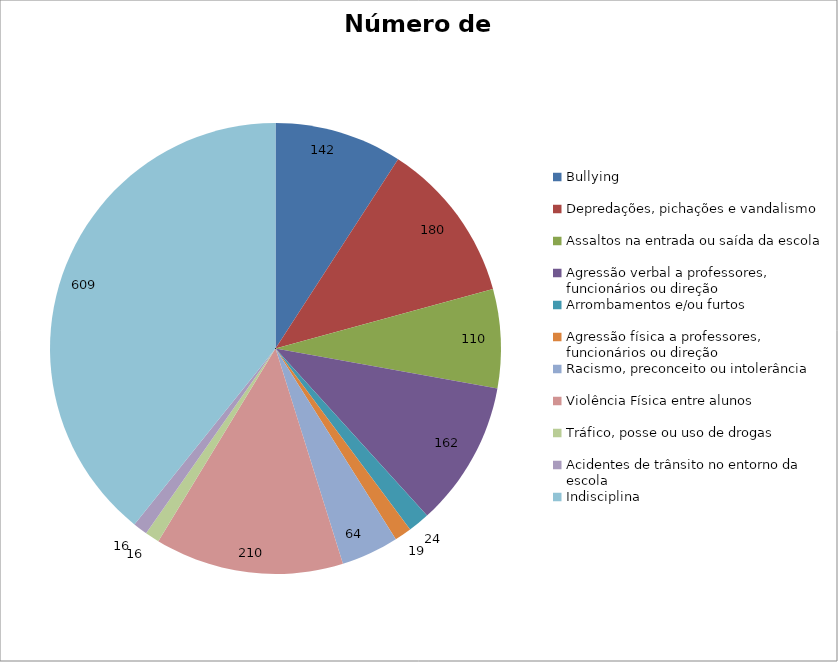
| Category | Número de Casos |
|---|---|
| Bullying | 142 |
| Depredações, pichações e vandalismo | 180 |
| Assaltos na entrada ou saída da escola | 110 |
| Agressão verbal a professores, funcionários ou direção | 162 |
| Arrombamentos e/ou furtos | 24 |
| Agressão física a professores, funcionários ou direção | 19 |
| Racismo, preconceito ou intolerância | 64 |
| Violência Física entre alunos | 210 |
| Tráfico, posse ou uso de drogas | 16 |
| Acidentes de trânsito no entorno da escola | 16 |
| Indisciplina | 609 |